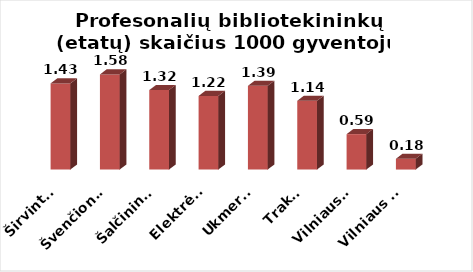
| Category | Series 0 |
|---|---|
| Širvintos | 1.433 |
| Švenčionys | 1.582 |
| Šalčininkai | 1.321 |
| Elektrėnai | 1.224 |
| Ukmergė | 1.393 |
| Trakai | 1.144 |
| Vilniaus r. | 0.589 |
| Vilniaus m. | 0.18 |